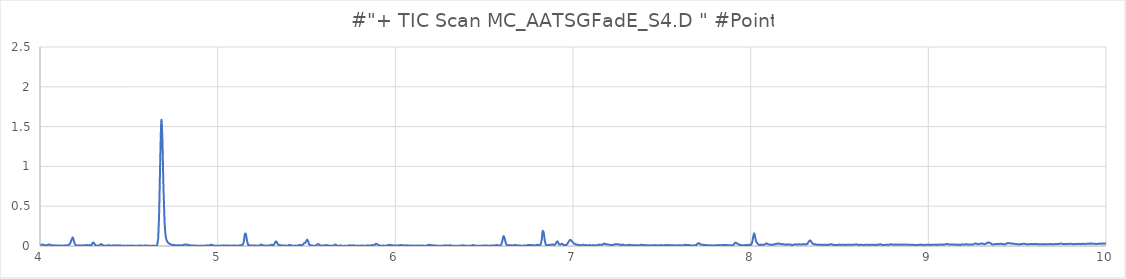
| Category | Series 0 |
|---|---|
| 3.393 | 0.005 |
| 3.399 | 0.013 |
| 3.405 | 0.017 |
| 3.411 | 0.015 |
| 3.417 | 0.013 |
| 3.422 | 0.01 |
| 3.428 | 0.01 |
| 3.434 | 0.007 |
| 3.44 | 0.007 |
| 3.446 | 0.008 |
| 3.452 | 0.006 |
| 3.458 | 0.007 |
| 3.464 | 0.008 |
| 3.47 | 0.007 |
| 3.476 | 0.006 |
| 3.482 | 0.009 |
| 3.488 | 0.004 |
| 3.494 | 0.01 |
| 3.5 | 0.012 |
| 3.506 | 0.007 |
| 3.512 | 0.009 |
| 3.518 | 0.009 |
| 3.524 | 0.007 |
| 3.529 | 0.006 |
| 3.535 | 0.01 |
| 3.541 | 0.009 |
| 3.547 | 0.01 |
| 3.553 | 0.009 |
| 3.559 | 0.007 |
| 3.565 | 0.008 |
| 3.571 | 0.007 |
| 3.577 | 0.005 |
| 3.583 | 0.005 |
| 3.589 | 0.007 |
| 3.595 | 0.007 |
| 3.601 | 0.004 |
| 3.607 | 0.006 |
| 3.613 | 0.005 |
| 3.619 | 0.01 |
| 3.625 | 0.013 |
| 3.631 | 0.03 |
| 3.637 | 0.065 |
| 3.642 | 0.091 |
| 3.648 | 0.068 |
| 3.654 | 0.044 |
| 3.66 | 0.017 |
| 3.666 | 0.005 |
| 3.672 | 0.005 |
| 3.678 | 0.008 |
| 3.684 | 0.008 |
| 3.69 | 0.017 |
| 3.696 | 0.019 |
| 3.702 | 0.013 |
| 3.708 | 0.013 |
| 3.714 | 0.024 |
| 3.72 | 0.043 |
| 3.726 | 0.052 |
| 3.732 | 0.022 |
| 3.738 | 0.01 |
| 3.744 | 0.004 |
| 3.749 | 0.005 |
| 3.755 | 0.01 |
| 3.761 | 0.006 |
| 3.767 | 0.008 |
| 3.773 | 0.005 |
| 3.779 | 0.005 |
| 3.785 | 0.006 |
| 3.791 | 0.006 |
| 3.797 | 0.008 |
| 3.803 | 0.006 |
| 3.809 | 0.006 |
| 3.815 | 0.007 |
| 3.821 | 0.008 |
| 3.827 | 0.003 |
| 3.833 | 0.002 |
| 3.839 | 0.004 |
| 3.845 | 0.004 |
| 3.851 | 0.003 |
| 3.857 | 0.008 |
| 3.862 | 0.006 |
| 3.868 | 0.011 |
| 3.874 | 0.01 |
| 3.88 | 0.01 |
| 3.886 | 0.013 |
| 3.892 | 0.012 |
| 3.898 | 0.019 |
| 3.904 | 0.059 |
| 3.91 | 0.11 |
| 3.916 | 0.085 |
| 3.922 | 0.03 |
| 3.928 | 0.012 |
| 3.934 | 0.01 |
| 3.94 | 0.024 |
| 3.946 | 0.048 |
| 3.952 | 0.055 |
| 3.958 | 0.037 |
| 3.964 | 0.034 |
| 3.969 | 0.058 |
| 3.975 | 0.086 |
| 3.981 | 0.074 |
| 3.987 | 0.049 |
| 3.993 | 0.024 |
| 3.999 | 0.014 |
| 4.005 | 0.014 |
| 4.011 | 0.017 |
| 4.017 | 0.017 |
| 4.023 | 0.013 |
| 4.029 | 0.009 |
| 4.035 | 0.009 |
| 4.041 | 0.01 |
| 4.047 | 0.017 |
| 4.053 | 0.02 |
| 4.059 | 0.012 |
| 4.065 | 0.008 |
| 4.071 | 0.009 |
| 4.077 | 0.006 |
| 4.082 | 0.008 |
| 4.088 | 0.008 |
| 4.094 | 0.006 |
| 4.1 | 0.006 |
| 4.106 | 0.007 |
| 4.112 | 0.005 |
| 4.118 | 0.004 |
| 4.124 | 0.006 |
| 4.13 | 0.003 |
| 4.136 | 0.006 |
| 4.142 | 0.008 |
| 4.148 | 0.006 |
| 4.154 | 0.006 |
| 4.16 | 0.014 |
| 4.166 | 0.022 |
| 4.172 | 0.046 |
| 4.178 | 0.082 |
| 4.184 | 0.11 |
| 4.189 | 0.077 |
| 4.195 | 0.033 |
| 4.201 | 0.013 |
| 4.207 | 0.008 |
| 4.213 | 0.005 |
| 4.219 | 0.008 |
| 4.225 | 0.008 |
| 4.231 | 0.005 |
| 4.237 | 0.006 |
| 4.243 | 0.009 |
| 4.249 | 0.005 |
| 4.255 | 0.01 |
| 4.261 | 0.009 |
| 4.267 | 0.013 |
| 4.273 | 0.007 |
| 4.279 | 0.011 |
| 4.285 | 0.009 |
| 4.291 | 0.018 |
| 4.297 | 0.04 |
| 4.302 | 0.042 |
| 4.308 | 0.021 |
| 4.314 | 0.01 |
| 4.32 | 0.005 |
| 4.326 | 0.004 |
| 4.332 | 0.006 |
| 4.338 | 0.016 |
| 4.344 | 0.025 |
| 4.35 | 0.016 |
| 4.356 | 0.009 |
| 4.362 | 0.003 |
| 4.368 | 0.003 |
| 4.374 | 0.005 |
| 4.38 | 0.007 |
| 4.386 | 0.01 |
| 4.392 | 0.007 |
| 4.398 | 0.005 |
| 4.404 | 0.004 |
| 4.409 | 0.007 |
| 4.415 | 0.008 |
| 4.421 | 0.01 |
| 4.427 | 0.006 |
| 4.433 | 0.008 |
| 4.439 | 0.008 |
| 4.445 | 0.004 |
| 4.451 | 0.009 |
| 4.457 | 0.003 |
| 4.463 | 0.005 |
| 4.469 | 0.003 |
| 4.475 | 0.005 |
| 4.481 | 0.002 |
| 4.487 | 0.004 |
| 4.493 | 0.005 |
| 4.499 | 0.005 |
| 4.505 | 0.004 |
| 4.511 | 0.006 |
| 4.517 | 0.005 |
| 4.522 | 0.004 |
| 4.528 | 0.004 |
| 4.534 | 0.001 |
| 4.54 | 0.004 |
| 4.546 | 0.003 |
| 4.552 | 0.005 |
| 4.558 | 0.005 |
| 4.564 | 0.006 |
| 4.57 | 0.005 |
| 4.576 | 0.003 |
| 4.582 | 0.004 |
| 4.588 | 0.005 |
| 4.594 | 0.005 |
| 4.6 | 0.005 |
| 4.606 | 0.005 |
| 4.612 | 0.002 |
| 4.618 | 0.003 |
| 4.624 | 0.004 |
| 4.629 | 0.004 |
| 4.635 | 0.002 |
| 4.641 | 0.003 |
| 4.647 | 0.003 |
| 4.653 | 0.004 |
| 4.659 | 0.011 |
| 4.665 | 0.092 |
| 4.671 | 0.443 |
| 4.677 | 1.115 |
| 4.683 | 1.58 |
| 4.689 | 1.331 |
| 4.695 | 0.72 |
| 4.701 | 0.305 |
| 4.707 | 0.134 |
| 4.713 | 0.072 |
| 4.719 | 0.046 |
| 4.725 | 0.035 |
| 4.731 | 0.025 |
| 4.737 | 0.02 |
| 4.742 | 0.015 |
| 4.748 | 0.014 |
| 4.754 | 0.013 |
| 4.76 | 0.009 |
| 4.766 | 0.008 |
| 4.772 | 0.008 |
| 4.778 | 0.009 |
| 4.784 | 0.009 |
| 4.79 | 0.006 |
| 4.796 | 0.009 |
| 4.802 | 0.01 |
| 4.808 | 0.013 |
| 4.814 | 0.018 |
| 4.82 | 0.02 |
| 4.826 | 0.016 |
| 4.832 | 0.016 |
| 4.838 | 0.012 |
| 4.844 | 0.01 |
| 4.849 | 0.008 |
| 4.855 | 0.007 |
| 4.861 | 0.007 |
| 4.867 | 0.004 |
| 4.873 | 0.008 |
| 4.879 | 0.003 |
| 4.885 | 0.002 |
| 4.891 | 0.004 |
| 4.897 | 0.004 |
| 4.903 | 0.004 |
| 4.909 | 0.005 |
| 4.915 | 0.003 |
| 4.921 | 0.004 |
| 4.927 | 0.003 |
| 4.933 | 0.007 |
| 4.939 | 0.005 |
| 4.945 | 0.009 |
| 4.951 | 0.005 |
| 4.957 | 0.012 |
| 4.962 | 0.017 |
| 4.968 | 0.014 |
| 4.974 | 0.009 |
| 4.98 | 0.007 |
| 4.986 | 0.003 |
| 4.992 | 0.003 |
| 4.998 | 0.003 |
| 5.004 | 0.003 |
| 5.01 | 0.002 |
| 5.016 | 0.003 |
| 5.022 | 0.007 |
| 5.028 | 0.006 |
| 5.034 | 0.006 |
| 5.04 | 0.006 |
| 5.046 | 0.007 |
| 5.052 | 0.007 |
| 5.058 | 0.007 |
| 5.064 | 0.008 |
| 5.069 | 0.005 |
| 5.075 | 0.004 |
| 5.081 | 0.005 |
| 5.087 | 0.007 |
| 5.093 | 0.005 |
| 5.099 | 0.005 |
| 5.105 | 0.005 |
| 5.111 | 0.002 |
| 5.117 | 0.004 |
| 5.123 | 0.008 |
| 5.129 | 0.009 |
| 5.135 | 0.011 |
| 5.141 | 0.017 |
| 5.147 | 0.057 |
| 5.153 | 0.148 |
| 5.159 | 0.147 |
| 5.165 | 0.071 |
| 5.171 | 0.017 |
| 5.177 | 0.008 |
| 5.182 | 0.008 |
| 5.188 | 0.006 |
| 5.194 | 0.005 |
| 5.2 | 0.005 |
| 5.206 | 0.005 |
| 5.212 | 0.007 |
| 5.218 | 0.004 |
| 5.224 | 0.004 |
| 5.23 | 0.004 |
| 5.236 | 0.008 |
| 5.242 | 0.015 |
| 5.248 | 0.017 |
| 5.254 | 0.009 |
| 5.26 | 0.007 |
| 5.266 | 0.006 |
| 5.272 | 0.003 |
| 5.278 | 0.005 |
| 5.284 | 0.005 |
| 5.289 | 0.005 |
| 5.295 | 0.009 |
| 5.301 | 0.016 |
| 5.307 | 0.014 |
| 5.313 | 0.011 |
| 5.319 | 0.025 |
| 5.325 | 0.051 |
| 5.331 | 0.055 |
| 5.337 | 0.031 |
| 5.343 | 0.013 |
| 5.349 | 0.013 |
| 5.355 | 0.009 |
| 5.361 | 0.006 |
| 5.367 | 0.006 |
| 5.373 | 0.006 |
| 5.379 | 0.007 |
| 5.385 | 0.003 |
| 5.391 | 0.004 |
| 5.397 | 0.007 |
| 5.402 | 0.012 |
| 5.408 | 0.013 |
| 5.414 | 0.008 |
| 5.42 | 0.003 |
| 5.426 | 0.001 |
| 5.432 | 0.005 |
| 5.438 | 0.005 |
| 5.444 | 0.002 |
| 5.45 | 0.005 |
| 5.456 | 0.01 |
| 5.462 | 0.013 |
| 5.468 | 0.011 |
| 5.474 | 0.011 |
| 5.48 | 0.019 |
| 5.486 | 0.035 |
| 5.492 | 0.038 |
| 5.498 | 0.06 |
| 5.504 | 0.081 |
| 5.509 | 0.063 |
| 5.515 | 0.021 |
| 5.521 | 0.011 |
| 5.527 | 0.005 |
| 5.533 | 0.006 |
| 5.539 | 0.003 |
| 5.545 | 0.002 |
| 5.551 | 0.007 |
| 5.557 | 0.013 |
| 5.563 | 0.023 |
| 5.569 | 0.022 |
| 5.575 | 0.008 |
| 5.581 | 0.005 |
| 5.587 | 0.006 |
| 5.593 | 0.006 |
| 5.599 | 0.003 |
| 5.605 | 0.01 |
| 5.611 | 0.011 |
| 5.617 | 0.009 |
| 5.622 | 0.007 |
| 5.628 | 0.005 |
| 5.634 | 0.002 |
| 5.64 | 0.003 |
| 5.646 | 0.003 |
| 5.652 | 0.002 |
| 5.658 | 0.015 |
| 5.664 | 0.017 |
| 5.67 | 0.007 |
| 5.676 | 0.004 |
| 5.682 | 0.001 |
| 5.688 | 0.007 |
| 5.694 | 0.006 |
| 5.7 | 0.003 |
| 5.706 | 0.001 |
| 5.712 | 0.002 |
| 5.718 | 0.003 |
| 5.724 | 0.002 |
| 5.729 | 0 |
| 5.735 | 0.006 |
| 5.741 | 0.01 |
| 5.747 | 0.008 |
| 5.753 | 0.006 |
| 5.759 | 0.007 |
| 5.765 | 0.009 |
| 5.771 | 0.004 |
| 5.777 | 0.002 |
| 5.783 | 0.004 |
| 5.789 | 0.005 |
| 5.795 | 0.004 |
| 5.801 | 0.002 |
| 5.807 | 0.005 |
| 5.813 | 0.007 |
| 5.819 | 0.004 |
| 5.825 | 0.004 |
| 5.831 | 0.004 |
| 5.837 | 0.004 |
| 5.842 | 0.008 |
| 5.848 | 0.006 |
| 5.854 | 0.006 |
| 5.86 | 0.006 |
| 5.866 | 0.009 |
| 5.872 | 0.011 |
| 5.878 | 0.008 |
| 5.884 | 0.015 |
| 5.89 | 0.029 |
| 5.896 | 0.024 |
| 5.902 | 0.016 |
| 5.908 | 0.008 |
| 5.914 | 0.006 |
| 5.92 | 0.002 |
| 5.926 | 0.004 |
| 5.932 | 0.006 |
| 5.938 | 0.003 |
| 5.944 | 0.003 |
| 5.949 | 0.006 |
| 5.955 | 0.007 |
| 5.961 | 0.012 |
| 5.967 | 0.013 |
| 5.973 | 0.012 |
| 5.979 | 0.008 |
| 5.985 | 0.008 |
| 5.991 | 0.005 |
| 5.997 | 0.006 |
| 6.003 | 0.005 |
| 6.009 | 0.006 |
| 6.015 | 0.006 |
| 6.021 | 0.008 |
| 6.027 | 0.013 |
| 6.033 | 0.013 |
| 6.039 | 0.007 |
| 6.045 | 0.008 |
| 6.051 | 0.007 |
| 6.057 | 0.007 |
| 6.062 | 0.011 |
| 6.068 | 0.007 |
| 6.074 | 0.007 |
| 6.08 | 0.007 |
| 6.086 | 0.005 |
| 6.092 | 0.004 |
| 6.098 | 0.005 |
| 6.104 | 0.005 |
| 6.11 | 0.004 |
| 6.116 | 0.003 |
| 6.122 | 0.007 |
| 6.128 | 0.004 |
| 6.134 | 0.008 |
| 6.14 | 0.005 |
| 6.146 | 0.003 |
| 6.152 | 0.005 |
| 6.158 | 0.005 |
| 6.164 | 0.004 |
| 6.169 | 0.002 |
| 6.175 | 0.005 |
| 6.181 | 0.011 |
| 6.187 | 0.015 |
| 6.193 | 0.014 |
| 6.199 | 0.012 |
| 6.205 | 0.009 |
| 6.211 | 0.007 |
| 6.217 | 0.009 |
| 6.223 | 0.004 |
| 6.229 | 0.006 |
| 6.235 | 0.003 |
| 6.241 | 0.003 |
| 6.247 | 0.004 |
| 6.253 | 0.004 |
| 6.259 | 0.004 |
| 6.265 | 0.004 |
| 6.271 | 0.006 |
| 6.277 | 0.006 |
| 6.282 | 0.009 |
| 6.288 | 0.004 |
| 6.294 | 0.006 |
| 6.3 | 0.006 |
| 6.306 | 0.009 |
| 6.312 | 0.008 |
| 6.318 | 0.003 |
| 6.324 | 0.003 |
| 6.33 | 0.004 |
| 6.336 | 0.001 |
| 6.342 | 0.003 |
| 6.348 | 0.002 |
| 6.354 | 0.001 |
| 6.36 | 0.004 |
| 6.366 | 0.005 |
| 6.372 | 0.005 |
| 6.378 | 0.006 |
| 6.384 | 0.009 |
| 6.389 | 0.008 |
| 6.395 | 0.003 |
| 6.401 | 0.003 |
| 6.407 | 0.002 |
| 6.413 | 0.004 |
| 6.419 | 0.004 |
| 6.425 | 0.005 |
| 6.431 | 0.005 |
| 6.437 | 0.013 |
| 6.443 | 0.008 |
| 6.449 | 0.006 |
| 6.455 | 0.003 |
| 6.461 | 0.002 |
| 6.467 | 0.002 |
| 6.473 | 0.003 |
| 6.479 | 0.004 |
| 6.485 | 0.004 |
| 6.491 | 0.006 |
| 6.497 | 0.008 |
| 6.502 | 0.006 |
| 6.508 | 0.005 |
| 6.514 | 0.006 |
| 6.52 | 0.004 |
| 6.526 | 0.004 |
| 6.532 | 0.007 |
| 6.538 | 0.004 |
| 6.544 | 0.005 |
| 6.55 | 0.005 |
| 6.556 | 0.006 |
| 6.562 | 0.008 |
| 6.568 | 0.01 |
| 6.574 | 0.012 |
| 6.58 | 0.007 |
| 6.586 | 0.007 |
| 6.592 | 0.011 |
| 6.598 | 0.028 |
| 6.604 | 0.08 |
| 6.609 | 0.124 |
| 6.615 | 0.097 |
| 6.621 | 0.043 |
| 6.627 | 0.014 |
| 6.633 | 0.009 |
| 6.639 | 0.01 |
| 6.645 | 0.009 |
| 6.651 | 0.01 |
| 6.657 | 0.008 |
| 6.663 | 0.008 |
| 6.669 | 0.01 |
| 6.675 | 0.013 |
| 6.681 | 0.01 |
| 6.687 | 0.007 |
| 6.693 | 0.008 |
| 6.699 | 0.007 |
| 6.705 | 0.008 |
| 6.711 | 0 |
| 6.717 | 0.003 |
| 6.722 | 0.005 |
| 6.728 | 0.005 |
| 6.734 | 0.006 |
| 6.74 | 0.007 |
| 6.746 | 0.012 |
| 6.752 | 0.011 |
| 6.758 | 0.013 |
| 6.764 | 0.013 |
| 6.77 | 0.01 |
| 6.776 | 0.008 |
| 6.782 | 0.008 |
| 6.788 | 0.006 |
| 6.794 | 0.012 |
| 6.8 | 0.014 |
| 6.806 | 0.014 |
| 6.812 | 0.012 |
| 6.818 | 0.023 |
| 6.824 | 0.079 |
| 6.829 | 0.184 |
| 6.835 | 0.166 |
| 6.841 | 0.073 |
| 6.847 | 0.019 |
| 6.853 | 0.008 |
| 6.859 | 0.012 |
| 6.865 | 0.013 |
| 6.871 | 0.014 |
| 6.877 | 0.016 |
| 6.883 | 0.021 |
| 6.889 | 0.015 |
| 6.895 | 0.014 |
| 6.901 | 0.023 |
| 6.907 | 0.046 |
| 6.913 | 0.058 |
| 6.919 | 0.032 |
| 6.925 | 0.018 |
| 6.931 | 0.019 |
| 6.937 | 0.028 |
| 6.942 | 0.023 |
| 6.948 | 0.012 |
| 6.954 | 0.013 |
| 6.96 | 0.012 |
| 6.966 | 0.022 |
| 6.972 | 0.04 |
| 6.978 | 0.061 |
| 6.984 | 0.077 |
| 6.99 | 0.07 |
| 6.996 | 0.054 |
| 7.002 | 0.04 |
| 7.008 | 0.029 |
| 7.014 | 0.024 |
| 7.02 | 0.018 |
| 7.026 | 0.016 |
| 7.032 | 0.013 |
| 7.038 | 0.011 |
| 7.044 | 0.01 |
| 7.049 | 0.01 |
| 7.055 | 0.015 |
| 7.061 | 0.015 |
| 7.067 | 0.01 |
| 7.073 | 0.013 |
| 7.079 | 0.005 |
| 7.085 | 0.009 |
| 7.091 | 0.01 |
| 7.097 | 0.011 |
| 7.103 | 0.006 |
| 7.109 | 0.008 |
| 7.115 | 0.008 |
| 7.121 | 0.011 |
| 7.127 | 0.008 |
| 7.133 | 0.007 |
| 7.139 | 0.012 |
| 7.145 | 0.018 |
| 7.151 | 0.015 |
| 7.157 | 0.016 |
| 7.162 | 0.015 |
| 7.168 | 0.02 |
| 7.174 | 0.03 |
| 7.18 | 0.025 |
| 7.186 | 0.024 |
| 7.192 | 0.019 |
| 7.198 | 0.018 |
| 7.204 | 0.017 |
| 7.21 | 0.015 |
| 7.216 | 0.013 |
| 7.222 | 0.014 |
| 7.228 | 0.015 |
| 7.234 | 0.02 |
| 7.24 | 0.022 |
| 7.246 | 0.023 |
| 7.252 | 0.022 |
| 7.258 | 0.019 |
| 7.264 | 0.017 |
| 7.27 | 0.011 |
| 7.275 | 0.013 |
| 7.281 | 0.018 |
| 7.287 | 0.012 |
| 7.293 | 0.007 |
| 7.299 | 0.009 |
| 7.305 | 0.011 |
| 7.311 | 0.013 |
| 7.317 | 0.013 |
| 7.323 | 0.015 |
| 7.329 | 0.009 |
| 7.335 | 0.012 |
| 7.341 | 0.009 |
| 7.347 | 0.011 |
| 7.353 | 0.01 |
| 7.359 | 0.01 |
| 7.365 | 0.01 |
| 7.371 | 0.006 |
| 7.377 | 0.011 |
| 7.382 | 0.014 |
| 7.388 | 0.015 |
| 7.394 | 0.011 |
| 7.4 | 0.013 |
| 7.406 | 0.01 |
| 7.412 | 0.009 |
| 7.418 | 0.008 |
| 7.424 | 0.009 |
| 7.43 | 0.008 |
| 7.436 | 0.007 |
| 7.442 | 0.01 |
| 7.448 | 0.01 |
| 7.454 | 0.009 |
| 7.46 | 0.008 |
| 7.466 | 0.012 |
| 7.472 | 0.007 |
| 7.478 | 0.007 |
| 7.484 | 0.011 |
| 7.49 | 0.01 |
| 7.495 | 0.012 |
| 7.501 | 0.009 |
| 7.507 | 0.009 |
| 7.513 | 0.006 |
| 7.519 | 0.013 |
| 7.525 | 0.014 |
| 7.531 | 0.011 |
| 7.537 | 0.012 |
| 7.543 | 0.01 |
| 7.549 | 0.011 |
| 7.555 | 0.009 |
| 7.561 | 0.011 |
| 7.567 | 0.008 |
| 7.573 | 0.008 |
| 7.579 | 0.006 |
| 7.585 | 0.009 |
| 7.591 | 0.008 |
| 7.597 | 0.009 |
| 7.602 | 0.008 |
| 7.608 | 0.01 |
| 7.614 | 0.007 |
| 7.62 | 0.006 |
| 7.626 | 0.015 |
| 7.632 | 0.014 |
| 7.638 | 0.014 |
| 7.644 | 0.013 |
| 7.65 | 0.012 |
| 7.656 | 0.011 |
| 7.662 | 0.007 |
| 7.668 | 0.007 |
| 7.674 | 0.008 |
| 7.68 | 0.007 |
| 7.686 | 0.009 |
| 7.692 | 0.01 |
| 7.698 | 0.024 |
| 7.704 | 0.034 |
| 7.71 | 0.034 |
| 7.715 | 0.024 |
| 7.721 | 0.02 |
| 7.727 | 0.015 |
| 7.733 | 0.016 |
| 7.739 | 0.011 |
| 7.745 | 0.014 |
| 7.751 | 0.01 |
| 7.757 | 0.009 |
| 7.763 | 0.009 |
| 7.769 | 0.007 |
| 7.775 | 0.009 |
| 7.781 | 0.01 |
| 7.787 | 0.006 |
| 7.793 | 0.005 |
| 7.799 | 0.009 |
| 7.805 | 0.009 |
| 7.811 | 0.011 |
| 7.817 | 0.009 |
| 7.822 | 0.013 |
| 7.828 | 0.011 |
| 7.834 | 0.01 |
| 7.84 | 0.011 |
| 7.846 | 0.012 |
| 7.852 | 0.013 |
| 7.858 | 0.011 |
| 7.864 | 0.013 |
| 7.87 | 0.009 |
| 7.876 | 0.01 |
| 7.882 | 0.01 |
| 7.888 | 0.01 |
| 7.894 | 0.007 |
| 7.9 | 0.011 |
| 7.906 | 0.02 |
| 7.912 | 0.041 |
| 7.918 | 0.039 |
| 7.924 | 0.032 |
| 7.93 | 0.023 |
| 7.935 | 0.016 |
| 7.941 | 0.016 |
| 7.947 | 0.01 |
| 7.953 | 0.01 |
| 7.959 | 0.011 |
| 7.965 | 0.011 |
| 7.971 | 0.011 |
| 7.977 | 0.011 |
| 7.983 | 0.011 |
| 7.989 | 0.011 |
| 7.995 | 0.019 |
| 8.001 | 0.014 |
| 8.007 | 0.036 |
| 8.013 | 0.098 |
| 8.019 | 0.158 |
| 8.025 | 0.115 |
| 8.031 | 0.057 |
| 8.037 | 0.037 |
| 8.042 | 0.023 |
| 8.048 | 0.014 |
| 8.054 | 0.014 |
| 8.06 | 0.018 |
| 8.066 | 0.014 |
| 8.072 | 0.014 |
| 8.078 | 0.019 |
| 8.084 | 0.027 |
| 8.09 | 0.033 |
| 8.096 | 0.025 |
| 8.102 | 0.018 |
| 8.108 | 0.016 |
| 8.114 | 0.017 |
| 8.12 | 0.014 |
| 8.126 | 0.016 |
| 8.132 | 0.022 |
| 8.138 | 0.021 |
| 8.144 | 0.028 |
| 8.15 | 0.026 |
| 8.155 | 0.031 |
| 8.161 | 0.031 |
| 8.167 | 0.026 |
| 8.173 | 0.023 |
| 8.179 | 0.024 |
| 8.185 | 0.022 |
| 8.191 | 0.018 |
| 8.197 | 0.018 |
| 8.203 | 0.02 |
| 8.209 | 0.018 |
| 8.215 | 0.021 |
| 8.221 | 0.018 |
| 8.227 | 0.016 |
| 8.233 | 0.011 |
| 8.239 | 0.015 |
| 8.245 | 0.018 |
| 8.251 | 0.021 |
| 8.257 | 0.017 |
| 8.262 | 0.018 |
| 8.268 | 0.021 |
| 8.274 | 0.021 |
| 8.28 | 0.018 |
| 8.286 | 0.02 |
| 8.292 | 0.022 |
| 8.298 | 0.02 |
| 8.304 | 0.021 |
| 8.31 | 0.022 |
| 8.316 | 0.021 |
| 8.322 | 0.035 |
| 8.328 | 0.06 |
| 8.334 | 0.07 |
| 8.34 | 0.058 |
| 8.346 | 0.036 |
| 8.352 | 0.027 |
| 8.358 | 0.02 |
| 8.364 | 0.022 |
| 8.37 | 0.019 |
| 8.375 | 0.017 |
| 8.381 | 0.016 |
| 8.387 | 0.016 |
| 8.393 | 0.015 |
| 8.399 | 0.016 |
| 8.405 | 0.013 |
| 8.411 | 0.016 |
| 8.417 | 0.015 |
| 8.423 | 0.017 |
| 8.429 | 0.011 |
| 8.435 | 0.013 |
| 8.441 | 0.019 |
| 8.447 | 0.019 |
| 8.453 | 0.023 |
| 8.459 | 0.02 |
| 8.465 | 0.016 |
| 8.471 | 0.011 |
| 8.477 | 0.011 |
| 8.482 | 0.013 |
| 8.488 | 0.015 |
| 8.494 | 0.012 |
| 8.5 | 0.018 |
| 8.506 | 0.013 |
| 8.512 | 0.017 |
| 8.518 | 0.016 |
| 8.524 | 0.014 |
| 8.53 | 0.015 |
| 8.536 | 0.013 |
| 8.542 | 0.015 |
| 8.548 | 0.014 |
| 8.554 | 0.017 |
| 8.56 | 0.016 |
| 8.566 | 0.016 |
| 8.572 | 0.014 |
| 8.578 | 0.015 |
| 8.584 | 0.017 |
| 8.59 | 0.02 |
| 8.595 | 0.018 |
| 8.601 | 0.019 |
| 8.607 | 0.013 |
| 8.613 | 0.012 |
| 8.619 | 0.017 |
| 8.625 | 0.015 |
| 8.631 | 0.014 |
| 8.637 | 0.01 |
| 8.643 | 0.014 |
| 8.649 | 0.016 |
| 8.655 | 0.014 |
| 8.661 | 0.017 |
| 8.667 | 0.014 |
| 8.673 | 0.014 |
| 8.679 | 0.014 |
| 8.685 | 0.014 |
| 8.691 | 0.015 |
| 8.697 | 0.015 |
| 8.702 | 0.014 |
| 8.708 | 0.012 |
| 8.714 | 0.018 |
| 8.72 | 0.015 |
| 8.726 | 0.021 |
| 8.732 | 0.021 |
| 8.738 | 0.016 |
| 8.744 | 0.012 |
| 8.75 | 0.014 |
| 8.756 | 0.013 |
| 8.762 | 0.016 |
| 8.768 | 0.016 |
| 8.774 | 0.015 |
| 8.78 | 0.017 |
| 8.786 | 0.021 |
| 8.792 | 0.021 |
| 8.798 | 0.018 |
| 8.804 | 0.018 |
| 8.81 | 0.014 |
| 8.815 | 0.019 |
| 8.821 | 0.016 |
| 8.827 | 0.018 |
| 8.833 | 0.019 |
| 8.839 | 0.015 |
| 8.845 | 0.015 |
| 8.851 | 0.019 |
| 8.857 | 0.018 |
| 8.863 | 0.016 |
| 8.869 | 0.018 |
| 8.875 | 0.02 |
| 8.881 | 0.016 |
| 8.887 | 0.016 |
| 8.893 | 0.015 |
| 8.899 | 0.017 |
| 8.905 | 0.015 |
| 8.911 | 0.016 |
| 8.917 | 0.014 |
| 8.922 | 0.012 |
| 8.928 | 0.012 |
| 8.934 | 0.011 |
| 8.94 | 0.014 |
| 8.946 | 0.016 |
| 8.952 | 0.016 |
| 8.958 | 0.017 |
| 8.964 | 0.014 |
| 8.97 | 0.015 |
| 8.976 | 0.012 |
| 8.982 | 0.014 |
| 8.988 | 0.017 |
| 8.994 | 0.015 |
| 9.0 | 0.016 |
| 9.006 | 0.017 |
| 9.012 | 0.011 |
| 9.018 | 0.015 |
| 9.024 | 0.014 |
| 9.03 | 0.016 |
| 9.035 | 0.018 |
| 9.041 | 0.016 |
| 9.047 | 0.015 |
| 9.053 | 0.014 |
| 9.059 | 0.017 |
| 9.065 | 0.018 |
| 9.071 | 0.019 |
| 9.077 | 0.015 |
| 9.083 | 0.018 |
| 9.089 | 0.019 |
| 9.095 | 0.021 |
| 9.101 | 0.025 |
| 9.107 | 0.025 |
| 9.113 | 0.021 |
| 9.119 | 0.018 |
| 9.125 | 0.02 |
| 9.131 | 0.017 |
| 9.137 | 0.019 |
| 9.142 | 0.018 |
| 9.148 | 0.018 |
| 9.154 | 0.016 |
| 9.16 | 0.015 |
| 9.166 | 0.017 |
| 9.172 | 0.018 |
| 9.178 | 0.011 |
| 9.184 | 0.015 |
| 9.19 | 0.022 |
| 9.196 | 0.018 |
| 9.202 | 0.019 |
| 9.208 | 0.02 |
| 9.214 | 0.022 |
| 9.22 | 0.02 |
| 9.226 | 0.019 |
| 9.232 | 0.018 |
| 9.238 | 0.02 |
| 9.244 | 0.019 |
| 9.25 | 0.019 |
| 9.255 | 0.022 |
| 9.261 | 0.028 |
| 9.267 | 0.032 |
| 9.273 | 0.028 |
| 9.279 | 0.021 |
| 9.285 | 0.025 |
| 9.291 | 0.028 |
| 9.297 | 0.028 |
| 9.303 | 0.032 |
| 9.309 | 0.028 |
| 9.315 | 0.022 |
| 9.321 | 0.026 |
| 9.327 | 0.032 |
| 9.333 | 0.039 |
| 9.339 | 0.046 |
| 9.345 | 0.039 |
| 9.351 | 0.033 |
| 9.357 | 0.024 |
| 9.362 | 0.019 |
| 9.368 | 0.021 |
| 9.374 | 0.023 |
| 9.38 | 0.026 |
| 9.386 | 0.024 |
| 9.392 | 0.026 |
| 9.398 | 0.026 |
| 9.404 | 0.028 |
| 9.41 | 0.028 |
| 9.416 | 0.025 |
| 9.422 | 0.022 |
| 9.428 | 0.023 |
| 9.434 | 0.022 |
| 9.44 | 0.03 |
| 9.446 | 0.036 |
| 9.452 | 0.036 |
| 9.458 | 0.034 |
| 9.464 | 0.033 |
| 9.47 | 0.027 |
| 9.475 | 0.03 |
| 9.481 | 0.029 |
| 9.487 | 0.027 |
| 9.493 | 0.025 |
| 9.499 | 0.024 |
| 9.505 | 0.021 |
| 9.511 | 0.02 |
| 9.517 | 0.022 |
| 9.523 | 0.027 |
| 9.529 | 0.025 |
| 9.535 | 0.028 |
| 9.541 | 0.028 |
| 9.547 | 0.025 |
| 9.553 | 0.022 |
| 9.559 | 0.021 |
| 9.565 | 0.021 |
| 9.571 | 0.024 |
| 9.577 | 0.024 |
| 9.582 | 0.024 |
| 9.588 | 0.026 |
| 9.594 | 0.022 |
| 9.6 | 0.025 |
| 9.606 | 0.026 |
| 9.612 | 0.025 |
| 9.618 | 0.023 |
| 9.624 | 0.021 |
| 9.63 | 0.022 |
| 9.636 | 0.023 |
| 9.642 | 0.021 |
| 9.648 | 0.021 |
| 9.654 | 0.025 |
| 9.66 | 0.021 |
| 9.666 | 0.023 |
| 9.672 | 0.023 |
| 9.678 | 0.023 |
| 9.684 | 0.026 |
| 9.69 | 0.023 |
| 9.695 | 0.022 |
| 9.701 | 0.021 |
| 9.707 | 0.022 |
| 9.713 | 0.025 |
| 9.719 | 0.023 |
| 9.725 | 0.026 |
| 9.731 | 0.025 |
| 9.737 | 0.026 |
| 9.743 | 0.031 |
| 9.749 | 0.03 |
| 9.755 | 0.026 |
| 9.761 | 0.025 |
| 9.767 | 0.026 |
| 9.773 | 0.024 |
| 9.779 | 0.026 |
| 9.785 | 0.027 |
| 9.791 | 0.024 |
| 9.797 | 0.027 |
| 9.802 | 0.029 |
| 9.808 | 0.027 |
| 9.814 | 0.023 |
| 9.82 | 0.024 |
| 9.826 | 0.026 |
| 9.832 | 0.026 |
| 9.838 | 0.024 |
| 9.844 | 0.03 |
| 9.85 | 0.026 |
| 9.856 | 0.025 |
| 9.862 | 0.024 |
| 9.868 | 0.027 |
| 9.874 | 0.03 |
| 9.88 | 0.026 |
| 9.886 | 0.025 |
| 9.892 | 0.03 |
| 9.898 | 0.028 |
| 9.904 | 0.032 |
| 9.91 | 0.026 |
| 9.915 | 0.033 |
| 9.921 | 0.03 |
| 9.927 | 0.027 |
| 9.933 | 0.028 |
| 9.939 | 0.028 |
| 9.945 | 0.023 |
| 9.951 | 0.028 |
| 9.957 | 0.03 |
| 9.963 | 0.028 |
| 9.969 | 0.032 |
| 9.975 | 0.026 |
| 9.981 | 0.032 |
| 9.987 | 0.029 |
| 9.993 | 0.03 |
| 9.999 | 0.03 |
| 10.005 | 0.028 |
| 10.011 | 0.025 |
| 10.017 | 0.026 |
| 10.022 | 0.027 |
| 10.028 | 0.03 |
| 10.034 | 0.032 |
| 10.04 | 0.03 |
| 10.046 | 0.035 |
| 10.052 | 0.033 |
| 10.058 | 0.031 |
| 10.064 | 0.033 |
| 10.07 | 0.032 |
| 10.076 | 0.036 |
| 10.082 | 0.031 |
| 10.088 | 0.034 |
| 10.094 | 0.032 |
| 10.1 | 0.034 |
| 10.106 | 0.038 |
| 10.112 | 0.036 |
| 10.118 | 0.038 |
| 10.124 | 0.037 |
| 10.13 | 0.034 |
| 10.135 | 0.039 |
| 10.141 | 0.033 |
| 10.147 | 0.037 |
| 10.153 | 0.038 |
| 10.159 | 0.034 |
| 10.165 | 0.036 |
| 10.171 | 0.034 |
| 10.177 | 0.034 |
| 10.183 | 0.038 |
| 10.189 | 0.037 |
| 10.195 | 0.042 |
| 10.201 | 0.041 |
| 10.207 | 0.042 |
| 10.213 | 0.045 |
| 10.219 | 0.039 |
| 10.225 | 0.043 |
| 10.231 | 0.046 |
| 10.237 | 0.047 |
| 10.242 | 0.043 |
| 10.248 | 0.046 |
| 10.254 | 0.046 |
| 10.26 | 0.051 |
| 10.266 | 0.045 |
| 10.272 | 0.047 |
| 10.278 | 0.05 |
| 10.284 | 0.056 |
| 10.29 | 0.056 |
| 10.296 | 0.049 |
| 10.302 | 0.053 |
| 10.308 | 0.054 |
| 10.314 | 0.063 |
| 10.32 | 0.067 |
| 10.326 | 0.069 |
| 10.332 | 0.068 |
| 10.338 | 0.075 |
| 10.344 | 0.064 |
| 10.35 | 0.072 |
| 10.355 | 0.072 |
| 10.361 | 0.075 |
| 10.367 | 0.067 |
| 10.373 | 0.075 |
| 10.379 | 0.075 |
| 10.385 | 0.08 |
| 10.391 | 0.078 |
| 10.397 | 0.076 |
| 10.403 | 0.087 |
| 10.409 | 0.087 |
| 10.415 | 0.09 |
| 10.421 | 0.088 |
| 10.427 | 0.103 |
| 10.433 | 0.268 |
| 10.439 | 1.888 |
| 10.445 | 9.49 |
| 10.451 | 25.855 |
| 10.457 | 44.611 |
| 10.462 | 61.784 |
| 10.468 | 76.838 |
| 10.474 | 91.431 |
| 10.48 | 100 |
| 10.486 | 83.841 |
| 10.492 | 35.206 |
| 10.498 | 9.916 |
| 10.504 | 3.645 |
| 10.51 | 1.936 |
| 10.516 | 1.295 |
| 10.522 | 0.984 |
| 10.528 | 0.805 |
| 10.534 | 0.682 |
| 10.54 | 0.576 |
| 10.546 | 0.518 |
| 10.552 | 0.473 |
| 10.558 | 0.414 |
| 10.564 | 0.394 |
| 10.57 | 0.362 |
| 10.575 | 0.343 |
| 10.581 | 0.325 |
| 10.587 | 0.299 |
| 10.593 | 0.281 |
| 10.599 | 0.26 |
| 10.605 | 0.247 |
| 10.611 | 0.245 |
| 10.617 | 0.234 |
| 10.623 | 0.238 |
| 10.629 | 0.216 |
| 10.635 | 0.22 |
| 10.641 | 0.206 |
| 10.647 | 0.19 |
| 10.653 | 0.19 |
| 10.659 | 0.194 |
| 10.665 | 0.185 |
| 10.671 | 0.189 |
| 10.677 | 0.174 |
| 10.682 | 0.174 |
| 10.688 | 0.165 |
| 10.694 | 0.175 |
| 10.7 | 0.16 |
| 10.706 | 0.162 |
| 10.712 | 0.158 |
| 10.718 | 0.157 |
| 10.724 | 0.154 |
| 10.73 | 0.156 |
| 10.736 | 0.148 |
| 10.742 | 0.146 |
| 10.748 | 0.15 |
| 10.754 | 0.147 |
| 10.76 | 0.145 |
| 10.766 | 0.144 |
| 10.772 | 0.136 |
| 10.778 | 0.136 |
| 10.784 | 0.132 |
| 10.79 | 0.135 |
| 10.795 | 0.138 |
| 10.801 | 0.139 |
| 10.807 | 0.134 |
| 10.813 | 0.127 |
| 10.819 | 0.135 |
| 10.825 | 0.133 |
| 10.831 | 0.131 |
| 10.837 | 0.136 |
| 10.843 | 0.131 |
| 10.849 | 0.124 |
| 10.855 | 0.123 |
| 10.861 | 0.126 |
| 10.867 | 0.122 |
| 10.873 | 0.127 |
| 10.879 | 0.117 |
| 10.885 | 0.121 |
| 10.891 | 0.124 |
| 10.897 | 0.12 |
| 10.902 | 0.122 |
| 10.908 | 0.117 |
| 10.914 | 0.114 |
| 10.92 | 0.119 |
| 10.926 | 0.115 |
| 10.932 | 0.112 |
| 10.938 | 0.124 |
| 10.944 | 0.121 |
| 10.95 | 0.116 |
| 10.956 | 0.114 |
| 10.962 | 0.116 |
| 10.968 | 0.117 |
| 10.974 | 0.123 |
| 10.98 | 0.121 |
| 10.986 | 0.121 |
| 10.992 | 0.119 |
| 10.998 | 0.121 |
| 11.004 | 0.12 |
| 11.01 | 0.119 |
| 11.015 | 0.12 |
| 11.021 | 0.121 |
| 11.027 | 0.112 |
| 11.033 | 0.119 |
| 11.039 | 0.119 |
| 11.045 | 0.119 |
| 11.051 | 0.122 |
| 11.057 | 0.115 |
| 11.063 | 0.117 |
| 11.069 | 0.113 |
| 11.075 | 0.12 |
| 11.081 | 0.117 |
| 11.087 | 0.112 |
| 11.093 | 0.11 |
| 11.099 | 0.106 |
| 11.105 | 0.111 |
| 11.111 | 0.113 |
| 11.117 | 0.119 |
| 11.122 | 0.112 |
| 11.128 | 0.12 |
| 11.134 | 0.11 |
| 11.14 | 0.105 |
| 11.146 | 0.11 |
| 11.152 | 0.111 |
| 11.158 | 0.111 |
| 11.164 | 0.117 |
| 11.17 | 0.111 |
| 11.176 | 0.114 |
| 11.182 | 0.114 |
| 11.188 | 0.111 |
| 11.194 | 0.108 |
| 11.2 | 0.117 |
| 11.206 | 0.118 |
| 11.212 | 0.113 |
| 11.218 | 0.116 |
| 11.224 | 0.115 |
| 11.23 | 0.114 |
| 11.235 | 0.116 |
| 11.241 | 0.114 |
| 11.247 | 0.12 |
| 11.253 | 0.113 |
| 11.259 | 0.116 |
| 11.265 | 0.122 |
| 11.271 | 0.114 |
| 11.277 | 0.122 |
| 11.283 | 0.123 |
| 11.289 | 0.12 |
| 11.295 | 0.114 |
| 11.301 | 0.115 |
| 11.307 | 0.115 |
| 11.313 | 0.112 |
| 11.319 | 0.116 |
| 11.325 | 0.117 |
| 11.331 | 0.123 |
| 11.337 | 0.112 |
| 11.342 | 0.126 |
| 11.348 | 0.124 |
| 11.354 | 0.118 |
| 11.36 | 0.122 |
| 11.366 | 0.118 |
| 11.372 | 0.124 |
| 11.378 | 0.12 |
| 11.384 | 0.126 |
| 11.39 | 0.129 |
| 11.396 | 0.117 |
| 11.402 | 0.119 |
| 11.408 | 0.118 |
| 11.414 | 0.128 |
| 11.42 | 0.121 |
| 11.426 | 0.124 |
| 11.432 | 0.121 |
| 11.438 | 0.124 |
| 11.444 | 0.13 |
| 11.45 | 0.133 |
| 11.455 | 0.135 |
| 11.461 | 0.175 |
| 11.467 | 0.254 |
| 11.473 | 0.334 |
| 11.479 | 0.306 |
| 11.485 | 0.223 |
| 11.491 | 0.186 |
| 11.497 | 0.171 |
| 11.503 | 0.146 |
| 11.509 | 0.145 |
| 11.515 | 0.142 |
| 11.521 | 0.133 |
| 11.527 | 0.134 |
| 11.533 | 0.127 |
| 11.539 | 0.137 |
| 11.545 | 0.136 |
| 11.551 | 0.136 |
| 11.557 | 0.136 |
| 11.562 | 0.138 |
| 11.568 | 0.136 |
| 11.574 | 0.13 |
| 11.58 | 0.131 |
| 11.586 | 0.132 |
| 11.592 | 0.134 |
| 11.598 | 0.137 |
| 11.604 | 0.134 |
| 11.61 | 0.139 |
| 11.616 | 0.132 |
| 11.622 | 0.141 |
| 11.628 | 0.15 |
| 11.634 | 0.168 |
| 11.64 | 0.151 |
| 11.646 | 0.156 |
| 11.652 | 0.143 |
| 11.658 | 0.144 |
| 11.664 | 0.141 |
| 11.67 | 0.127 |
| 11.675 | 0.139 |
| 11.681 | 0.135 |
| 11.687 | 0.13 |
| 11.693 | 0.136 |
| 11.699 | 0.136 |
| 11.705 | 0.13 |
| 11.711 | 0.128 |
| 11.717 | 0.133 |
| 11.723 | 0.126 |
| 11.729 | 0.135 |
| 11.735 | 0.136 |
| 11.741 | 0.135 |
| 11.747 | 0.141 |
| 11.753 | 0.143 |
| 11.759 | 0.161 |
| 11.765 | 0.177 |
| 11.771 | 0.182 |
| 11.777 | 0.168 |
| 11.782 | 0.161 |
| 11.788 | 0.15 |
| 11.794 | 0.143 |
| 11.8 | 0.137 |
| 11.806 | 0.138 |
| 11.812 | 0.145 |
| 11.818 | 0.13 |
| 11.824 | 0.14 |
| 11.83 | 0.144 |
| 11.836 | 0.135 |
| 11.842 | 0.144 |
| 11.848 | 0.139 |
| 11.854 | 0.136 |
| 11.86 | 0.141 |
| 11.866 | 0.135 |
| 11.872 | 0.128 |
| 11.878 | 0.145 |
| 11.884 | 0.138 |
| 11.89 | 0.138 |
| 11.895 | 0.14 |
| 11.901 | 0.138 |
| 11.907 | 0.132 |
| 11.913 | 0.133 |
| 11.919 | 0.133 |
| 11.925 | 0.14 |
| 11.931 | 0.135 |
| 11.937 | 0.14 |
| 11.943 | 0.135 |
| 11.949 | 0.143 |
| 11.955 | 0.136 |
| 11.961 | 0.143 |
| 11.967 | 0.136 |
| 11.973 | 0.146 |
| 11.979 | 0.139 |
| 11.985 | 0.136 |
| 11.991 | 0.149 |
| 11.997 | 0.138 |
| 12.002 | 0.136 |
| 12.008 | 0.138 |
| 12.014 | 0.135 |
| 12.02 | 0.139 |
| 12.026 | 0.137 |
| 12.032 | 0.142 |
| 12.038 | 0.142 |
| 12.044 | 0.138 |
| 12.05 | 0.138 |
| 12.056 | 0.14 |
| 12.062 | 0.141 |
| 12.068 | 0.143 |
| 12.074 | 0.146 |
| 12.08 | 0.149 |
| 12.086 | 0.148 |
| 12.092 | 0.144 |
| 12.098 | 0.147 |
| 12.104 | 0.142 |
| 12.11 | 0.146 |
| 12.115 | 0.146 |
| 12.121 | 0.151 |
| 12.127 | 0.149 |
| 12.133 | 0.147 |
| 12.139 | 0.144 |
| 12.145 | 0.14 |
| 12.151 | 0.155 |
| 12.157 | 0.146 |
| 12.163 | 0.149 |
| 12.169 | 0.15 |
| 12.175 | 0.149 |
| 12.181 | 0.147 |
| 12.187 | 0.152 |
| 12.193 | 0.152 |
| 12.199 | 0.153 |
| 12.205 | 0.148 |
| 12.211 | 0.157 |
| 12.217 | 0.154 |
| 12.222 | 0.151 |
| 12.228 | 0.146 |
| 12.234 | 0.158 |
| 12.24 | 0.162 |
| 12.246 | 0.173 |
| 12.252 | 0.171 |
| 12.258 | 0.179 |
| 12.264 | 0.177 |
| 12.27 | 0.191 |
| 12.276 | 0.189 |
| 12.282 | 0.188 |
| 12.288 | 0.188 |
| 12.294 | 0.19 |
| 12.3 | 0.186 |
| 12.306 | 0.191 |
| 12.312 | 0.185 |
| 12.318 | 0.187 |
| 12.324 | 0.177 |
| 12.33 | 0.177 |
| 12.335 | 0.179 |
| 12.341 | 0.173 |
| 12.347 | 0.177 |
| 12.353 | 0.17 |
| 12.359 | 0.179 |
| 12.365 | 0.176 |
| 12.371 | 0.176 |
| 12.377 | 0.164 |
| 12.383 | 0.167 |
| 12.389 | 0.166 |
| 12.395 | 0.169 |
| 12.401 | 0.165 |
| 12.407 | 0.171 |
| 12.413 | 0.154 |
| 12.419 | 0.164 |
| 12.425 | 0.163 |
| 12.431 | 0.163 |
| 12.437 | 0.156 |
| 12.442 | 0.156 |
| 12.448 | 0.155 |
| 12.454 | 0.161 |
| 12.46 | 0.162 |
| 12.466 | 0.165 |
| 12.472 | 0.166 |
| 12.478 | 0.188 |
| 12.484 | 0.202 |
| 12.49 | 0.218 |
| 12.496 | 0.189 |
| 12.502 | 0.181 |
| 12.508 | 0.176 |
| 12.514 | 0.18 |
| 12.52 | 0.19 |
| 12.526 | 0.209 |
| 12.532 | 0.261 |
| 12.538 | 0.29 |
| 12.544 | 0.266 |
| 12.55 | 0.218 |
| 12.555 | 0.174 |
| 12.561 | 0.164 |
| 12.567 | 0.163 |
| 12.573 | 0.162 |
| 12.579 | 0.161 |
| 12.585 | 0.159 |
| 12.591 | 0.165 |
| 12.597 | 0.16 |
| 12.603 | 0.154 |
| 12.609 | 0.163 |
| 12.615 | 0.163 |
| 12.621 | 0.169 |
| 12.627 | 0.168 |
| 12.633 | 0.171 |
| 12.639 | 0.162 |
| 12.645 | 0.167 |
| 12.651 | 0.17 |
| 12.657 | 0.173 |
| 12.662 | 0.161 |
| 12.668 | 0.16 |
| 12.674 | 0.163 |
| 12.68 | 0.157 |
| 12.686 | 0.175 |
| 12.692 | 0.167 |
| 12.698 | 0.166 |
| 12.704 | 0.171 |
| 12.71 | 0.171 |
| 12.716 | 0.171 |
| 12.722 | 0.168 |
| 12.728 | 0.164 |
| 12.734 | 0.16 |
| 12.74 | 0.167 |
| 12.746 | 0.17 |
| 12.752 | 0.168 |
| 12.758 | 0.174 |
| 12.764 | 0.167 |
| 12.77 | 0.167 |
| 12.775 | 0.159 |
| 12.781 | 0.156 |
| 12.787 | 0.166 |
| 12.793 | 0.16 |
| 12.799 | 0.169 |
| 12.805 | 0.159 |
| 12.811 | 0.166 |
| 12.817 | 0.162 |
| 12.823 | 0.168 |
| 12.829 | 0.158 |
| 12.835 | 0.16 |
| 12.841 | 0.158 |
| 12.847 | 0.164 |
| 12.853 | 0.17 |
| 12.859 | 0.153 |
| 12.865 | 0.159 |
| 12.871 | 0.149 |
| 12.877 | 0.165 |
| 12.882 | 0.167 |
| 12.888 | 0.162 |
| 12.894 | 0.162 |
| 12.9 | 0.154 |
| 12.906 | 0.159 |
| 12.912 | 0.152 |
| 12.918 | 0.16 |
| 12.924 | 0.16 |
| 12.93 | 0.165 |
| 12.936 | 0.165 |
| 12.942 | 0.167 |
| 12.948 | 0.16 |
| 12.954 | 0.163 |
| 12.96 | 0.162 |
| 12.966 | 0.168 |
| 12.972 | 0.168 |
| 12.978 | 0.164 |
| 12.984 | 0.159 |
| 12.99 | 0.166 |
| 12.995 | 0.163 |
| 13.001 | 0.169 |
| 13.007 | 0.162 |
| 13.013 | 0.167 |
| 13.019 | 0.165 |
| 13.025 | 0.164 |
| 13.031 | 0.163 |
| 13.037 | 0.155 |
| 13.043 | 0.169 |
| 13.049 | 0.159 |
| 13.055 | 0.165 |
| 13.061 | 0.16 |
| 13.067 | 0.159 |
| 13.073 | 0.165 |
| 13.079 | 0.157 |
| 13.085 | 0.168 |
| 13.091 | 0.166 |
| 13.097 | 0.162 |
| 13.102 | 0.168 |
| 13.108 | 0.163 |
| 13.114 | 0.162 |
| 13.12 | 0.164 |
| 13.126 | 0.165 |
| 13.132 | 0.173 |
| 13.138 | 0.165 |
| 13.144 | 0.157 |
| 13.15 | 0.159 |
| 13.156 | 0.163 |
| 13.162 | 0.178 |
| 13.168 | 0.167 |
| 13.174 | 0.161 |
| 13.18 | 0.159 |
| 13.186 | 0.166 |
| 13.192 | 0.173 |
| 13.198 | 0.171 |
| 13.204 | 0.17 |
| 13.21 | 0.168 |
| 13.215 | 0.169 |
| 13.221 | 0.172 |
| 13.227 | 0.168 |
| 13.233 | 0.169 |
| 13.239 | 0.171 |
| 13.245 | 0.175 |
| 13.251 | 0.169 |
| 13.257 | 0.178 |
| 13.263 | 0.168 |
| 13.269 | 0.156 |
| 13.275 | 0.178 |
| 13.281 | 0.173 |
| 13.287 | 0.175 |
| 13.293 | 0.168 |
| 13.299 | 0.175 |
| 13.305 | 0.167 |
| 13.311 | 0.166 |
| 13.317 | 0.166 |
| 13.322 | 0.175 |
| 13.328 | 0.168 |
| 13.334 | 0.165 |
| 13.34 | 0.16 |
| 13.346 | 0.168 |
| 13.352 | 0.164 |
| 13.358 | 0.166 |
| 13.364 | 0.168 |
| 13.37 | 0.166 |
| 13.376 | 0.169 |
| 13.382 | 0.17 |
| 13.388 | 0.169 |
| 13.394 | 0.171 |
| 13.4 | 0.155 |
| 13.406 | 0.163 |
| 13.412 | 0.159 |
| 13.418 | 0.174 |
| 13.424 | 0.165 |
| 13.43 | 0.169 |
| 13.435 | 0.17 |
| 13.441 | 0.172 |
| 13.447 | 0.162 |
| 13.453 | 0.165 |
| 13.459 | 0.171 |
| 13.465 | 0.173 |
| 13.471 | 0.169 |
| 13.477 | 0.168 |
| 13.483 | 0.17 |
| 13.489 | 0.166 |
| 13.495 | 0.163 |
| 13.501 | 0.163 |
| 13.507 | 0.166 |
| 13.513 | 0.17 |
| 13.519 | 0.177 |
| 13.525 | 0.165 |
| 13.531 | 0.168 |
| 13.537 | 0.166 |
| 13.542 | 0.16 |
| 13.548 | 0.157 |
| 13.554 | 0.168 |
| 13.56 | 0.166 |
| 13.566 | 0.169 |
| 13.572 | 0.167 |
| 13.578 | 0.171 |
| 13.584 | 0.182 |
| 13.59 | 0.184 |
| 13.596 | 0.174 |
| 13.602 | 0.168 |
| 13.608 | 0.165 |
| 13.614 | 0.177 |
| 13.62 | 0.169 |
| 13.626 | 0.17 |
| 13.632 | 0.171 |
| 13.638 | 0.164 |
| 13.644 | 0.172 |
| 13.65 | 0.162 |
| 13.655 | 0.166 |
| 13.661 | 0.165 |
| 13.667 | 0.171 |
| 13.673 | 0.163 |
| 13.679 | 0.173 |
| 13.685 | 0.158 |
| 13.691 | 0.167 |
| 13.697 | 0.164 |
| 13.703 | 0.174 |
| 13.709 | 0.186 |
| 13.715 | 0.209 |
| 13.721 | 0.21 |
| 13.727 | 0.229 |
| 13.733 | 0.239 |
| 13.739 | 0.228 |
| 13.745 | 0.204 |
| 13.751 | 0.186 |
| 13.757 | 0.182 |
| 13.763 | 0.182 |
| 13.768 | 0.178 |
| 13.774 | 0.176 |
| 13.78 | 0.181 |
| 13.786 | 0.166 |
| 13.792 | 0.173 |
| 13.798 | 0.177 |
| 13.804 | 0.177 |
| 13.81 | 0.181 |
| 13.816 | 0.177 |
| 13.822 | 0.165 |
| 13.828 | 0.177 |
| 13.834 | 0.174 |
| 13.84 | 0.176 |
| 13.846 | 0.165 |
| 13.852 | 0.17 |
| 13.858 | 0.181 |
| 13.864 | 0.16 |
| 13.87 | 0.171 |
| 13.875 | 0.181 |
| 13.881 | 0.181 |
| 13.887 | 0.178 |
| 13.893 | 0.171 |
| 13.899 | 0.169 |
| 13.905 | 0.162 |
| 13.911 | 0.17 |
| 13.917 | 0.168 |
| 13.923 | 0.174 |
| 13.929 | 0.171 |
| 13.935 | 0.178 |
| 13.941 | 0.17 |
| 13.947 | 0.179 |
| 13.953 | 0.173 |
| 13.959 | 0.174 |
| 13.965 | 0.167 |
| 13.971 | 0.169 |
| 13.977 | 0.17 |
| 13.983 | 0.178 |
| 13.988 | 0.172 |
| 13.994 | 0.181 |
| 14.0 | 0.174 |
| 14.006 | 0.178 |
| 14.012 | 0.189 |
| 14.018 | 0.197 |
| 14.024 | 0.184 |
| 14.03 | 0.182 |
| 14.036 | 0.175 |
| 14.042 | 0.183 |
| 14.048 | 0.179 |
| 14.054 | 0.173 |
| 14.06 | 0.172 |
| 14.066 | 0.175 |
| 14.072 | 0.171 |
| 14.078 | 0.163 |
| 14.084 | 0.168 |
| 14.09 | 0.171 |
| 14.095 | 0.174 |
| 14.101 | 0.163 |
| 14.107 | 0.179 |
| 14.113 | 0.168 |
| 14.119 | 0.175 |
| 14.125 | 0.177 |
| 14.131 | 0.175 |
| 14.137 | 0.16 |
| 14.143 | 0.171 |
| 14.149 | 0.174 |
| 14.155 | 0.178 |
| 14.161 | 0.166 |
| 14.167 | 0.171 |
| 14.173 | 0.169 |
| 14.179 | 0.174 |
| 14.185 | 0.169 |
| 14.191 | 0.164 |
| 14.197 | 0.169 |
| 14.203 | 0.172 |
| 14.208 | 0.173 |
| 14.214 | 0.169 |
| 14.22 | 0.174 |
| 14.226 | 0.177 |
| 14.232 | 0.168 |
| 14.238 | 0.17 |
| 14.244 | 0.176 |
| 14.25 | 0.175 |
| 14.256 | 0.173 |
| 14.262 | 0.173 |
| 14.268 | 0.175 |
| 14.274 | 0.176 |
| 14.28 | 0.175 |
| 14.286 | 0.175 |
| 14.292 | 0.168 |
| 14.298 | 0.169 |
| 14.304 | 0.174 |
| 14.31 | 0.175 |
| 14.315 | 0.175 |
| 14.321 | 0.176 |
| 14.327 | 0.17 |
| 14.333 | 0.174 |
| 14.339 | 0.174 |
| 14.345 | 0.174 |
| 14.351 | 0.179 |
| 14.357 | 0.166 |
| 14.363 | 0.167 |
| 14.369 | 0.181 |
| 14.375 | 0.176 |
| 14.381 | 0.174 |
| 14.387 | 0.183 |
| 14.393 | 0.168 |
| 14.399 | 0.177 |
| 14.405 | 0.179 |
| 14.411 | 0.181 |
| 14.417 | 0.179 |
| 14.423 | 0.184 |
| 14.428 | 0.183 |
| 14.434 | 0.177 |
| 14.44 | 0.183 |
| 14.446 | 0.173 |
| 14.452 | 0.194 |
| 14.458 | 0.179 |
| 14.464 | 0.178 |
| 14.47 | 0.185 |
| 14.476 | 0.189 |
| 14.482 | 0.188 |
| 14.488 | 0.181 |
| 14.494 | 0.171 |
| 14.5 | 0.193 |
| 14.506 | 0.184 |
| 14.512 | 0.175 |
| 14.518 | 0.183 |
| 14.524 | 0.181 |
| 14.53 | 0.188 |
| 14.535 | 0.179 |
| 14.541 | 0.177 |
| 14.547 | 0.168 |
| 14.553 | 0.178 |
| 14.559 | 0.168 |
| 14.565 | 0.171 |
| 14.571 | 0.178 |
| 14.577 | 0.17 |
| 14.583 | 0.158 |
| 14.589 | 0.175 |
| 14.595 | 0.172 |
| 14.601 | 0.161 |
| 14.607 | 0.172 |
| 14.613 | 0.177 |
| 14.619 | 0.169 |
| 14.625 | 0.181 |
| 14.631 | 0.171 |
| 14.637 | 0.176 |
| 14.643 | 0.168 |
| 14.648 | 0.172 |
| 14.654 | 0.166 |
| 14.66 | 0.171 |
| 14.666 | 0.18 |
| 14.672 | 0.173 |
| 14.678 | 0.171 |
| 14.684 | 0.169 |
| 14.69 | 0.167 |
| 14.696 | 0.174 |
| 14.702 | 0.165 |
| 14.708 | 0.166 |
| 14.714 | 0.172 |
| 14.72 | 0.169 |
| 14.726 | 0.175 |
| 14.732 | 0.174 |
| 14.738 | 0.178 |
| 14.744 | 0.173 |
| 14.75 | 0.169 |
| 14.755 | 0.175 |
| 14.761 | 0.175 |
| 14.767 | 0.174 |
| 14.773 | 0.168 |
| 14.779 | 0.167 |
| 14.785 | 0.158 |
| 14.791 | 0.176 |
| 14.797 | 0.173 |
| 14.803 | 0.17 |
| 14.809 | 0.174 |
| 14.815 | 0.183 |
| 14.821 | 0.178 |
| 14.827 | 0.168 |
| 14.833 | 0.18 |
| 14.839 | 0.177 |
| 14.845 | 0.173 |
| 14.851 | 0.178 |
| 14.857 | 0.163 |
| 14.863 | 0.172 |
| 14.868 | 0.176 |
| 14.874 | 0.175 |
| 14.88 | 0.169 |
| 14.886 | 0.167 |
| 14.892 | 0.175 |
| 14.898 | 0.162 |
| 14.904 | 0.173 |
| 14.91 | 0.169 |
| 14.916 | 0.177 |
| 14.922 | 0.178 |
| 14.928 | 0.164 |
| 14.934 | 0.169 |
| 14.94 | 0.172 |
| 14.946 | 0.178 |
| 14.952 | 0.174 |
| 14.958 | 0.171 |
| 14.964 | 0.177 |
| 14.97 | 0.174 |
| 14.975 | 0.188 |
| 14.981 | 0.177 |
| 14.987 | 0.176 |
| 14.993 | 0.178 |
| 14.999 | 0.177 |
| 15.005 | 0.177 |
| 15.011 | 0.173 |
| 15.017 | 0.172 |
| 15.023 | 0.163 |
| 15.029 | 0.172 |
| 15.035 | 0.168 |
| 15.041 | 0.175 |
| 15.047 | 0.173 |
| 15.053 | 0.176 |
| 15.059 | 0.177 |
| 15.065 | 0.171 |
| 15.071 | 0.174 |
| 15.077 | 0.173 |
| 15.083 | 0.181 |
| 15.088 | 0.188 |
| 15.094 | 0.178 |
| 15.1 | 0.174 |
| 15.106 | 0.168 |
| 15.112 | 0.166 |
| 15.118 | 0.172 |
| 15.124 | 0.176 |
| 15.13 | 0.174 |
| 15.136 | 0.169 |
| 15.142 | 0.172 |
| 15.148 | 0.182 |
| 15.154 | 0.18 |
| 15.16 | 0.169 |
| 15.166 | 0.181 |
| 15.172 | 0.183 |
| 15.178 | 0.182 |
| 15.184 | 0.179 |
| 15.19 | 0.176 |
| 15.195 | 0.172 |
| 15.201 | 0.18 |
| 15.207 | 0.178 |
| 15.213 | 0.173 |
| 15.219 | 0.179 |
| 15.225 | 0.168 |
| 15.231 | 0.173 |
| 15.237 | 0.174 |
| 15.243 | 0.182 |
| 15.249 | 0.182 |
| 15.255 | 0.17 |
| 15.261 | 0.175 |
| 15.267 | 0.18 |
| 15.273 | 0.18 |
| 15.279 | 0.182 |
| 15.285 | 0.177 |
| 15.291 | 0.173 |
| 15.297 | 0.178 |
| 15.303 | 0.168 |
| 15.308 | 0.18 |
| 15.314 | 0.171 |
| 15.32 | 0.172 |
| 15.326 | 0.172 |
| 15.332 | 0.167 |
| 15.338 | 0.167 |
| 15.344 | 0.171 |
| 15.35 | 0.173 |
| 15.356 | 0.177 |
| 15.362 | 0.178 |
| 15.368 | 0.168 |
| 15.374 | 0.171 |
| 15.38 | 0.185 |
| 15.386 | 0.174 |
| 15.392 | 0.177 |
| 15.398 | 0.174 |
| 15.404 | 0.181 |
| 15.41 | 0.181 |
| 15.415 | 0.185 |
| 15.421 | 0.189 |
| 15.427 | 0.206 |
| 15.433 | 0.215 |
| 15.439 | 0.248 |
| 15.445 | 0.26 |
| 15.451 | 0.309 |
| 15.457 | 0.318 |
| 15.463 | 0.3 |
| 15.469 | 0.303 |
| 15.475 | 0.265 |
| 15.481 | 0.253 |
| 15.487 | 0.24 |
| 15.493 | 0.224 |
| 15.499 | 0.228 |
| 15.505 | 0.221 |
| 15.511 | 0.212 |
| 15.517 | 0.219 |
| 15.523 | 0.202 |
| 15.528 | 0.209 |
| 15.534 | 0.194 |
| 15.54 | 0.212 |
| 15.546 | 0.194 |
| 15.552 | 0.193 |
| 15.558 | 0.197 |
| 15.564 | 0.201 |
| 15.57 | 0.194 |
| 15.576 | 0.196 |
| 15.582 | 0.186 |
| 15.588 | 0.192 |
| 15.594 | 0.19 |
| 15.6 | 0.191 |
| 15.606 | 0.19 |
| 15.612 | 0.196 |
| 15.618 | 0.188 |
| 15.624 | 0.191 |
| 15.63 | 0.186 |
| 15.635 | 0.183 |
| 15.641 | 0.188 |
| 15.647 | 0.179 |
| 15.653 | 0.182 |
| 15.659 | 0.188 |
| 15.665 | 0.191 |
| 15.671 | 0.186 |
| 15.677 | 0.188 |
| 15.683 | 0.193 |
| 15.689 | 0.189 |
| 15.695 | 0.181 |
| 15.701 | 0.18 |
| 15.707 | 0.183 |
| 15.713 | 0.188 |
| 15.719 | 0.173 |
| 15.725 | 0.177 |
| 15.731 | 0.177 |
| 15.737 | 0.176 |
| 15.743 | 0.18 |
| 15.748 | 0.176 |
| 15.754 | 0.181 |
| 15.76 | 0.187 |
| 15.766 | 0.192 |
| 15.772 | 0.189 |
| 15.778 | 0.184 |
| 15.784 | 0.185 |
| 15.79 | 0.177 |
| 15.796 | 0.194 |
| 15.802 | 0.184 |
| 15.808 | 0.176 |
| 15.814 | 0.178 |
| 15.82 | 0.188 |
| 15.826 | 0.191 |
| 15.832 | 0.204 |
| 15.838 | 0.214 |
| 15.844 | 0.226 |
| 15.85 | 0.253 |
| 15.855 | 0.279 |
| 15.861 | 0.296 |
| 15.867 | 0.316 |
| 15.873 | 0.31 |
| 15.879 | 0.299 |
| 15.885 | 0.286 |
| 15.891 | 0.272 |
| 15.897 | 0.247 |
| 15.903 | 0.247 |
| 15.909 | 0.232 |
| 15.915 | 0.232 |
| 15.921 | 0.22 |
| 15.927 | 0.214 |
| 15.933 | 0.222 |
| 15.939 | 0.198 |
| 15.945 | 0.211 |
| 15.951 | 0.206 |
| 15.957 | 0.211 |
| 15.963 | 0.199 |
| 15.968 | 0.204 |
| 15.974 | 0.211 |
| 15.98 | 0.2 |
| 15.986 | 0.204 |
| 15.992 | 0.202 |
| 15.998 | 0.2 |
| 16.004 | 0.196 |
| 16.01 | 0.193 |
| 16.016 | 0.19 |
| 16.022 | 0.198 |
| 16.028 | 0.192 |
| 16.034 | 0.2 |
| 16.04 | 0.198 |
| 16.046 | 0.189 |
| 16.052 | 0.184 |
| 16.058 | 0.194 |
| 16.064 | 0.191 |
| 16.07 | 0.186 |
| 16.075 | 0.194 |
| 16.081 | 0.196 |
| 16.087 | 0.191 |
| 16.093 | 0.197 |
| 16.099 | 0.194 |
| 16.105 | 0.198 |
| 16.111 | 0.188 |
| 16.117 | 0.198 |
| 16.123 | 0.191 |
| 16.129 | 0.182 |
| 16.135 | 0.186 |
| 16.141 | 0.184 |
| 16.147 | 0.182 |
| 16.153 | 0.192 |
| 16.159 | 0.183 |
| 16.165 | 0.182 |
| 16.171 | 0.204 |
| 16.177 | 0.192 |
| 16.183 | 0.187 |
| 16.188 | 0.179 |
| 16.194 | 0.191 |
| 16.2 | 0.181 |
| 16.206 | 0.185 |
| 16.212 | 0.187 |
| 16.218 | 0.19 |
| 16.224 | 0.194 |
| 16.23 | 0.191 |
| 16.236 | 0.188 |
| 16.242 | 0.187 |
| 16.248 | 0.187 |
| 16.254 | 0.185 |
| 16.26 | 0.188 |
| 16.266 | 0.184 |
| 16.272 | 0.174 |
| 16.278 | 0.187 |
| 16.284 | 0.19 |
| 16.29 | 0.193 |
| 16.295 | 0.184 |
| 16.301 | 0.186 |
| 16.307 | 0.186 |
| 16.313 | 0.189 |
| 16.319 | 0.185 |
| 16.325 | 0.191 |
| 16.331 | 0.176 |
| 16.337 | 0.185 |
| 16.343 | 0.182 |
| 16.349 | 0.18 |
| 16.355 | 0.183 |
| 16.361 | 0.174 |
| 16.367 | 0.186 |
| 16.373 | 0.18 |
| 16.379 | 0.181 |
| 16.385 | 0.176 |
| 16.391 | 0.178 |
| 16.397 | 0.176 |
| 16.403 | 0.183 |
| 16.408 | 0.187 |
| 16.414 | 0.184 |
| 16.42 | 0.189 |
| 16.426 | 0.186 |
| 16.432 | 0.191 |
| 16.438 | 0.182 |
| 16.444 | 0.181 |
| 16.45 | 0.182 |
| 16.456 | 0.175 |
| 16.462 | 0.186 |
| 16.468 | 0.186 |
| 16.474 | 0.178 |
| 16.48 | 0.191 |
| 16.486 | 0.182 |
| 16.492 | 0.178 |